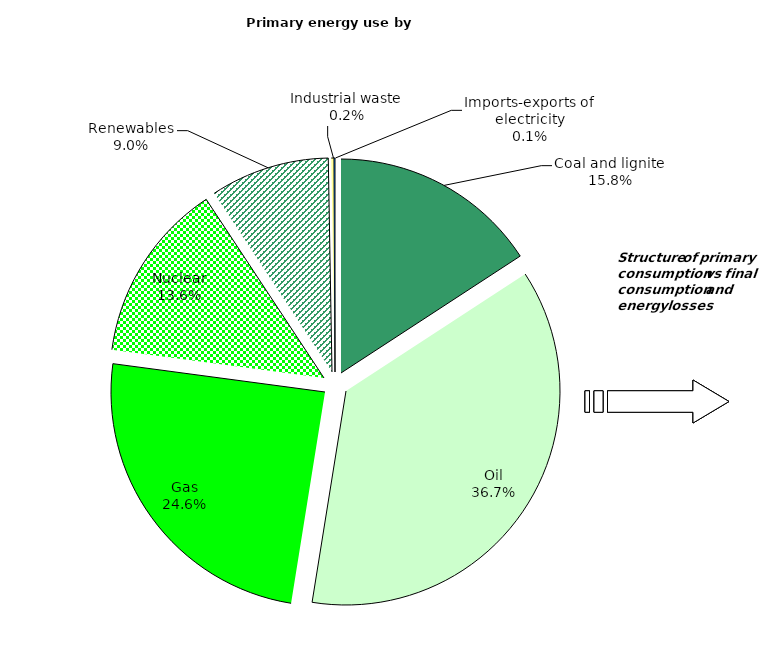
| Category | Series 0 |
|---|---|
| Coal and lignite | 267914 |
| Oil | 622858 |
| Gas | 416792 |
| Nuclear | 230767 |
| Renewables | 152597 |
| Industrial waste | 3415 |
| Imports-exports of electricity | 1301 |